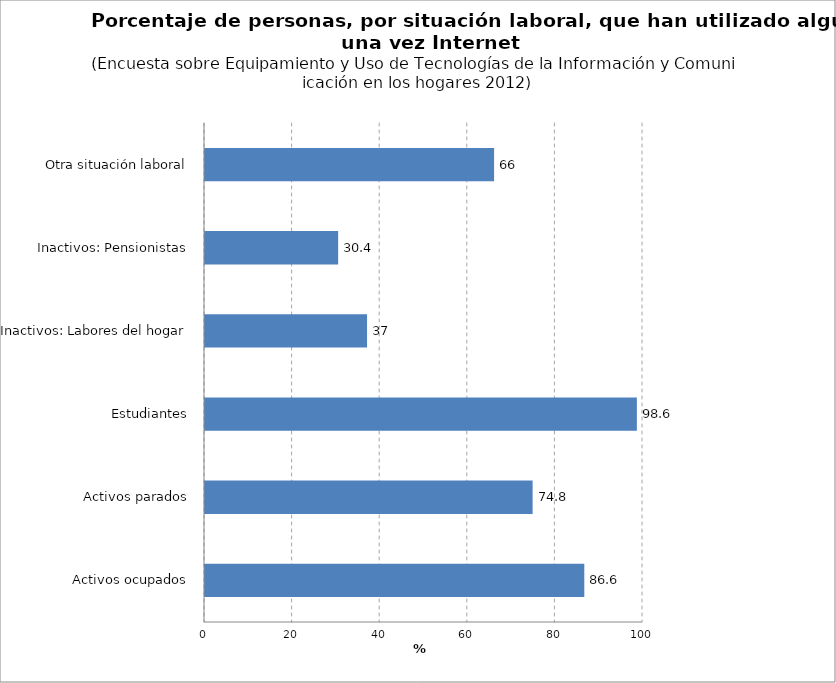
| Category | % |
|---|---|
| Activos ocupados | 86.6 |
| Activos parados | 74.8 |
|  Estudiantes | 98.6 |
| Inactivos: Labores del hogar | 37 |
|  Inactivos: Pensionistas | 30.4 |
|  Otra situación laboral | 66 |